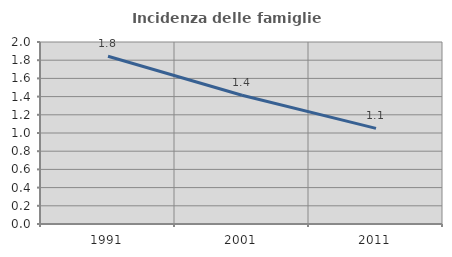
| Category | Incidenza delle famiglie numerose |
|---|---|
| 1991.0 | 1.843 |
| 2001.0 | 1.415 |
| 2011.0 | 1.051 |